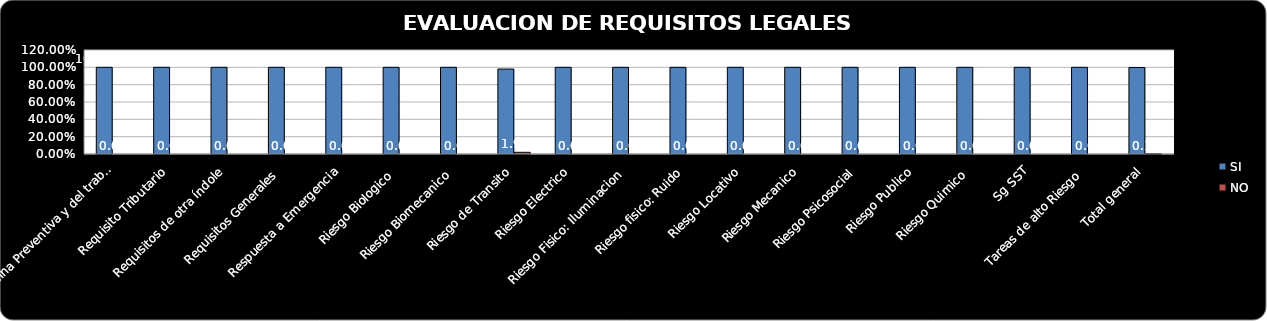
| Category | SI | NO                            |
|---|---|---|
| Medicina Preventiva y del trabajo  | 1 | 0 |
| Requisito Tributario | 1 | 0 |
| Requisitos de otra índole | 1 | 0 |
| Requisitos Generales  | 1 | 0 |
| Respuesta a Emergencia | 1 | 0 |
| Riesgo Biologico  | 1 | 0 |
| Riesgo Biomecanico  | 1 | 0 |
| Riesgo de Transito | 0.98 | 0.02 |
| Riesgo Electrico | 1 | 0 |
| Riesgo Fisico: Iluminacion  | 1 | 0 |
| Riesgo fisico: Ruido | 1 | 0 |
| Riesgo Locativo | 1 | 0 |
| Riesgo Mecanico | 1 | 0 |
| Riesgo Psicosocial | 1 | 0 |
| Riesgo Publico | 1 | 0 |
| Riesgo Quimico  | 1 | 0 |
| Sg SST | 1 | 0 |
| Tareas de alto Riesgo  | 1 | 0 |
| Total general | 0.998 | 0.002 |